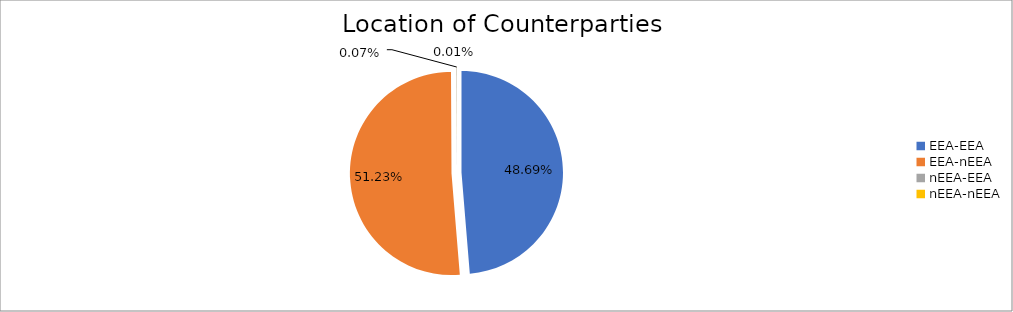
| Category | Series 0 |
|---|---|
| EEA-EEA | 5457265.545 |
| EEA-nEEA | 5741115.873 |
| nEEA-EEA | 7370.496 |
| nEEA-nEEA | 1579.701 |